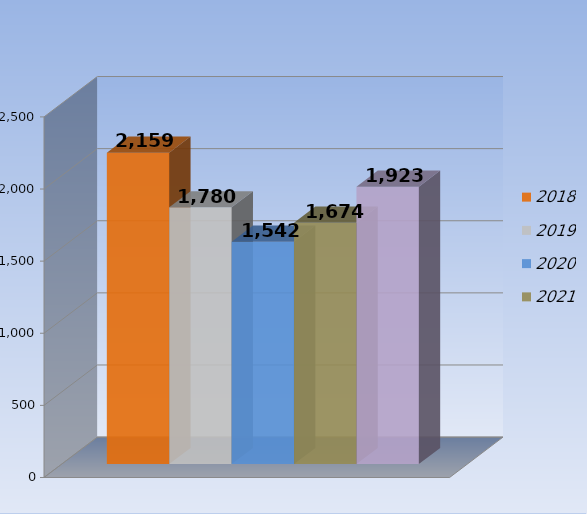
| Category | 2018 | 2019 | 2020 | 2021 | 2022 |
|---|---|---|---|---|---|
| 0 | 2159 | 1780 | 1542 | 1674 | 1923 |